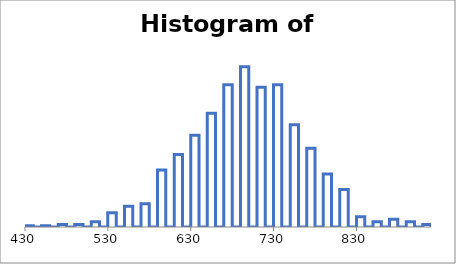
| Category | $G$4 |
|---|---|
| 430.0 | 0 |
| 430.0 | 1 |
| 440.0 | 1 |
| 440.0 | 0 |
| 450.0 | 0 |
| 450.0 | 1 |
| 460.0 | 1 |
| 460.0 | 0 |
| 470.0 | 0 |
| 470.0 | 2 |
| 480.0 | 2 |
| 480.0 | 0 |
| 490.0 | 0 |
| 490.0 | 2 |
| 500.0 | 2 |
| 500.0 | 0 |
| 510.0 | 0 |
| 510.0 | 4 |
| 520.0 | 4 |
| 520.0 | 0 |
| 530.0 | 0 |
| 530.0 | 11 |
| 540.0 | 11 |
| 540.0 | 0 |
| 550.0 | 0 |
| 550.0 | 16 |
| 560.0 | 16 |
| 560.0 | 0 |
| 570.0 | 0 |
| 570.0 | 18 |
| 580.0 | 18 |
| 580.0 | 0 |
| 590.0 | 0 |
| 590.0 | 44 |
| 600.0 | 44 |
| 600.0 | 0 |
| 610.0 | 0 |
| 610.0 | 56 |
| 620.0 | 56 |
| 620.0 | 0 |
| 630.0 | 0 |
| 630.0 | 71 |
| 640.0 | 71 |
| 640.0 | 0 |
| 650.0 | 0 |
| 650.0 | 88 |
| 660.0 | 88 |
| 660.0 | 0 |
| 670.0 | 0 |
| 670.0 | 110 |
| 680.0 | 110 |
| 680.0 | 0 |
| 690.0 | 0 |
| 690.0 | 124 |
| 700.0 | 124 |
| 700.0 | 0 |
| 710.0 | 0 |
| 710.0 | 108 |
| 720.0 | 108 |
| 720.0 | 0 |
| 730.0 | 0 |
| 730.0 | 110 |
| 740.0 | 110 |
| 740.0 | 0 |
| 750.0 | 0 |
| 750.0 | 79 |
| 760.0 | 79 |
| 760.0 | 0 |
| 770.0 | 0 |
| 770.0 | 61 |
| 780.0 | 61 |
| 780.0 | 0 |
| 790.0 | 0 |
| 790.0 | 41 |
| 800.0 | 41 |
| 800.0 | 0 |
| 810.0 | 0 |
| 810.0 | 29 |
| 820.0 | 29 |
| 820.0 | 0 |
| 830.0 | 0 |
| 830.0 | 8 |
| 840.0 | 8 |
| 840.0 | 0 |
| 850.0 | 0 |
| 850.0 | 4 |
| 860.0 | 4 |
| 860.0 | 0 |
| 870.0 | 0 |
| 870.0 | 6 |
| 880.0 | 6 |
| 880.0 | 0 |
| 890.0 | 0 |
| 890.0 | 4 |
| 900.0 | 4 |
| 900.0 | 0 |
| 910.0 | 0 |
| 910.0 | 2 |
| 920.0 | 2 |
| 920.0 | 0 |